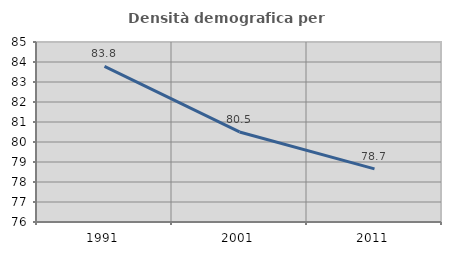
| Category | Densità demografica |
|---|---|
| 1991.0 | 83.779 |
| 2001.0 | 80.502 |
| 2011.0 | 78.654 |